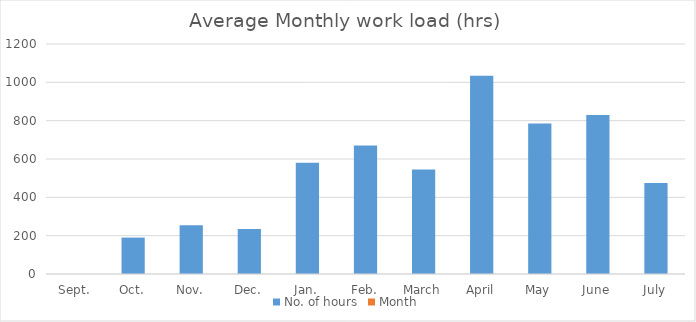
| Category | No. of hours | Month |
|---|---|---|
| Sept. | 0 | 0 |
| Oct. | 190 | 0 |
| Nov. | 255 | 0 |
| Dec. | 235 | 0 |
| Jan. | 580 | 0 |
| Feb. | 670 | 0 |
| March | 545 | 0 |
| April | 1035 | 0 |
| May | 785 | 0 |
| June | 830 | 0 |
| July | 475 | 0 |